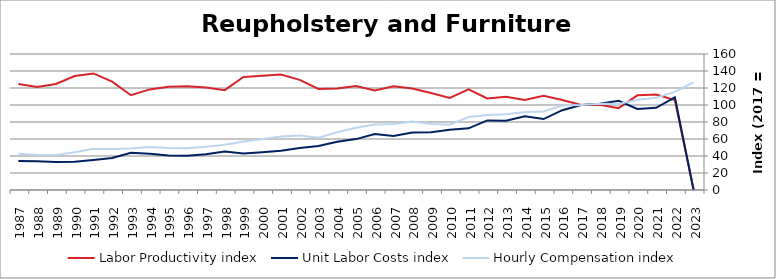
| Category | Labor Productivity index | Unit Labor Costs index | Hourly Compensation index |
|---|---|---|---|
| 2023.0 | 0 | 0 | 126.799 |
| 2022.0 | 105.913 | 109.006 | 115.451 |
| 2021.0 | 112.331 | 96.639 | 108.555 |
| 2020.0 | 111.401 | 95.34 | 106.21 |
| 2019.0 | 96.323 | 105.002 | 101.142 |
| 2018.0 | 100.226 | 101.383 | 101.612 |
| 2017.0 | 100 | 100 | 100 |
| 2016.0 | 105.791 | 93.895 | 99.332 |
| 2015.0 | 110.852 | 83.422 | 92.474 |
| 2014.0 | 105.837 | 86.633 | 91.69 |
| 2013.0 | 109.586 | 81.408 | 89.212 |
| 2012.0 | 107.734 | 81.845 | 88.175 |
| 2011.0 | 118.382 | 72.503 | 85.83 |
| 2010.0 | 108.248 | 70.985 | 76.84 |
| 2009.0 | 114.021 | 68.02 | 77.557 |
| 2008.0 | 119.343 | 67.521 | 80.582 |
| 2007.0 | 121.912 | 63.642 | 77.588 |
| 2006.0 | 116.986 | 65.79 | 76.965 |
| 2005.0 | 122.455 | 59.865 | 73.308 |
| 2004.0 | 119.461 | 56.796 | 67.849 |
| 2003.0 | 118.881 | 51.665 | 61.42 |
| 2002.0 | 129.525 | 49.397 | 63.981 |
| 2001.0 | 135.906 | 46.246 | 62.851 |
| 2000.0 | 134.401 | 44.436 | 59.722 |
| 1999.0 | 132.877 | 42.941 | 57.058 |
| 1998.0 | 117.49 | 45.276 | 53.195 |
| 1997.0 | 120.545 | 42.132 | 50.788 |
| 1996.0 | 122.091 | 40.316 | 49.222 |
| 1995.0 | 121.35 | 40.655 | 49.335 |
| 1994.0 | 118.343 | 42.64 | 50.462 |
| 1993.0 | 111.493 | 43.881 | 48.925 |
| 1992.0 | 127.477 | 37.748 | 48.12 |
| 1991.0 | 137.167 | 35.434 | 48.603 |
| 1990.0 | 134.134 | 33.142 | 44.455 |
| 1989.0 | 124.773 | 33.037 | 41.221 |
| 1988.0 | 121.307 | 33.85 | 41.062 |
| 1987.0 | 124.832 | 34.053 | 42.509 |